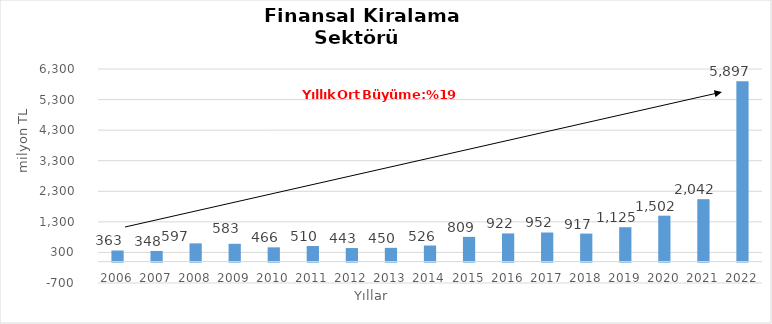
| Category | Finansal Kiralama  |
|---|---|
| 2006.0 | 363.206 |
| 2007.0 | 348.066 |
| 2008.0 | 596.686 |
| 2009.0 | 582.74 |
| 2010.0 | 466.416 |
| 2011.0 | 509.999 |
| 2012.0 | 443.41 |
| 2013.0 | 450.17 |
| 2014.0 | 525.856 |
| 2015.0 | 809 |
| 2016.0 | 922 |
| 2017.0 | 952 |
| 2018.0 | 917 |
| 2019.0 | 1125 |
| 2020.0 | 1502 |
| 2021.0 | 2042 |
| 2022.0 | 5897 |